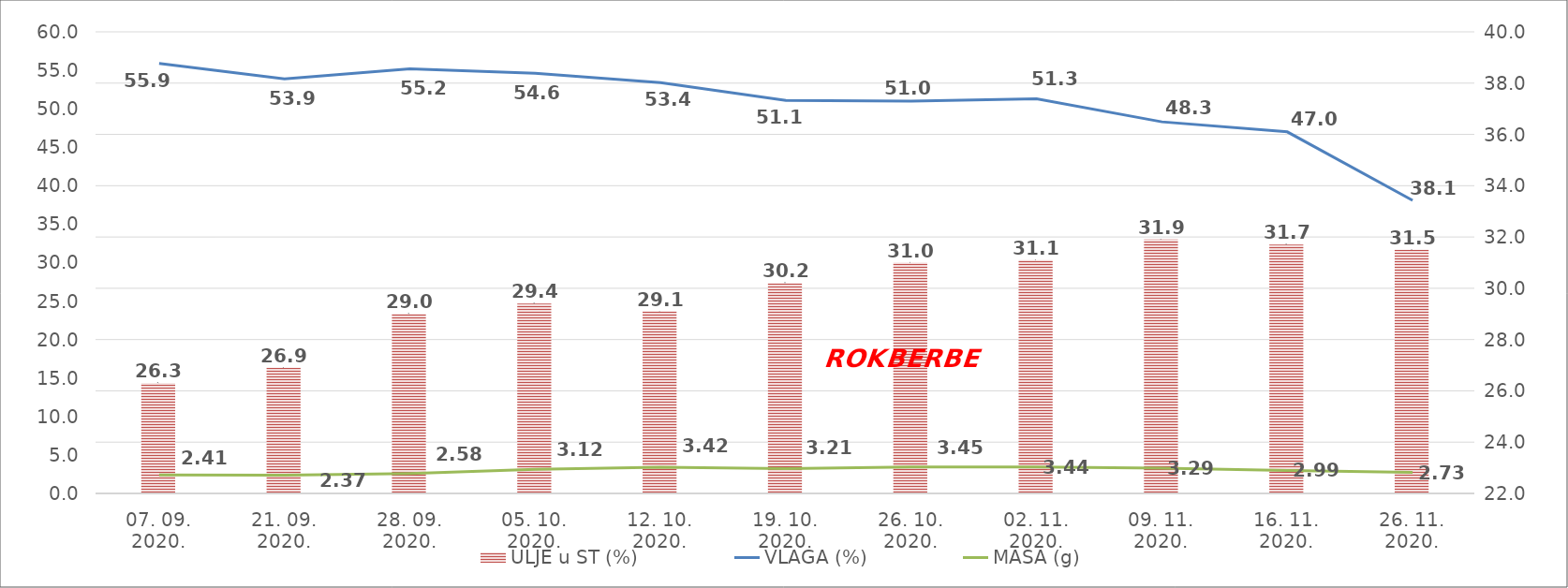
| Category | ULJE u ST (%) |
|---|---|
| 07. 09. 2020. | 26.3 |
| 21. 09. 2020. | 26.9 |
| 28. 09. 2020. | 29 |
| 05. 10. 2020. | 29.4 |
| 12. 10. 2020. | 29.1 |
| 19. 10. 2020. | 30.2 |
| 26. 10. 2020. | 31 |
| 02. 11. 2020. | 31.1 |
| 09. 11. 2020. | 31.9 |
| 16. 11. 2020. | 31.7 |
| 26. 11. 2020. | 31.5 |